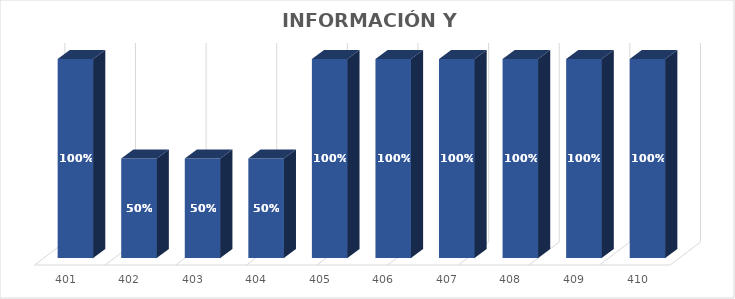
| Category | % Avance |
|---|---|
| 401.0 | 1 |
| 402.0 | 0.5 |
| 403.0 | 0.5 |
| 404.0 | 0.5 |
| 405.0 | 1 |
| 406.0 | 1 |
| 407.0 | 1 |
| 408.0 | 1 |
| 409.0 | 1 |
| 410.0 | 1 |